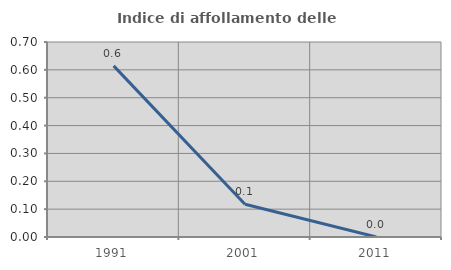
| Category | Indice di affollamento delle abitazioni  |
|---|---|
| 1991.0 | 0.614 |
| 2001.0 | 0.118 |
| 2011.0 | 0 |